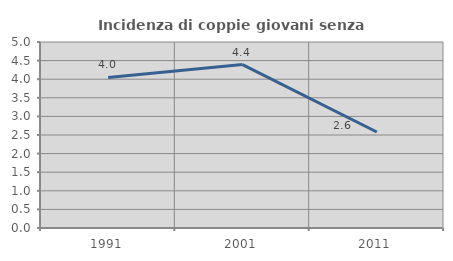
| Category | Incidenza di coppie giovani senza figli |
|---|---|
| 1991.0 | 4.046 |
| 2001.0 | 4.394 |
| 2011.0 | 2.58 |